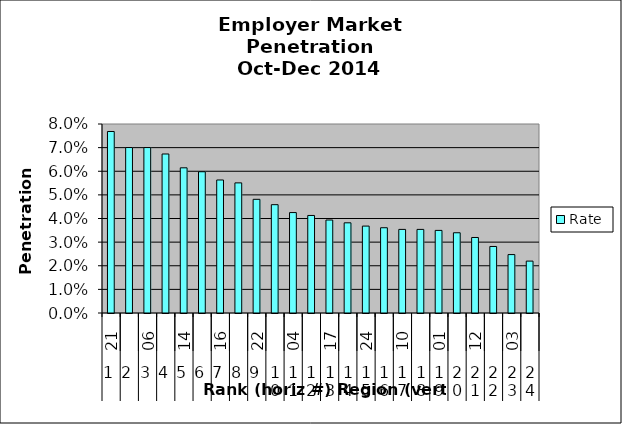
| Category | Rate |
|---|---|
| 0 | 0.077 |
| 1 | 0.07 |
| 2 | 0.07 |
| 3 | 0.067 |
| 4 | 0.061 |
| 5 | 0.06 |
| 6 | 0.056 |
| 7 | 0.055 |
| 8 | 0.048 |
| 9 | 0.046 |
| 10 | 0.043 |
| 11 | 0.041 |
| 12 | 0.039 |
| 13 | 0.038 |
| 14 | 0.037 |
| 15 | 0.036 |
| 16 | 0.035 |
| 17 | 0.035 |
| 18 | 0.035 |
| 19 | 0.034 |
| 20 | 0.032 |
| 21 | 0.028 |
| 22 | 0.025 |
| 23 | 0.022 |